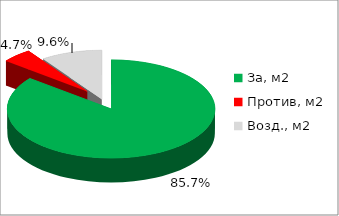
| Category | Series 0 |
|---|---|
| За, м2 | 0.857 |
| Против, м2 | 0.047 |
| Возд., м2 | 0.096 |